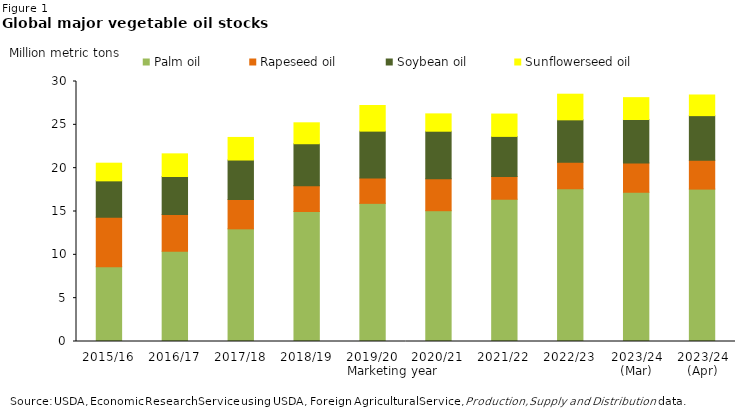
| Category | Palm oil | Rapeseed oil | Soybean oil | Sunflowerseed oil  |
|---|---|---|---|---|
| 2015/16 | 8.634 | 5.71 | 4.193 | 2.038 |
| 2016/17 | 10.405 | 4.252 | 4.379 | 2.616 |
| 2017/18 | 12.997 | 3.395 | 4.548 | 2.606 |
| 2018/19 | 15.003 | 2.97 | 4.846 | 2.415 |
| 2019/20 | 15.939 | 2.916 | 5.419 | 2.959 |
| 2020/21 | 15.092 | 3.673 | 5.499 | 2 |
| 2021/22 | 16.415 | 2.619 | 4.631 | 2.579 |
| 2022/23 | 17.623 | 3.067 | 4.887 | 2.958 |
| 2023/24 (Mar) | 17.22 | 3.384 | 5.012 | 2.521 |
| 2023/24 (Apr) | 17.584 | 3.32 | 5.157 | 2.382 |